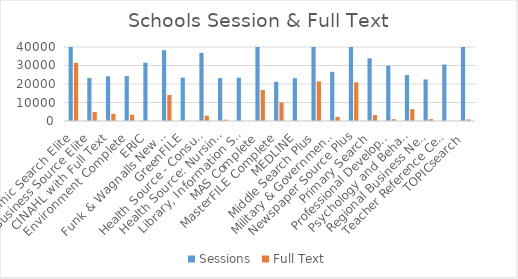
| Category | Sessions | Full Text |
|---|---|---|
| Academic Search Elite | 42030 | 31445 |
| Business Source Elite | 23180 | 4828 |
| CINAHL with Full Text | 24188 | 3913 |
| Environment Complete | 24301 | 3414 |
| ERIC | 31503 | 0 |
| Funk & Wagnalls New World Encyclopedia | 38270 | 14056 |
| GreenFILE | 23423 | 58 |
| Health Source - Consumer Edition | 36804 | 2898 |
| Health Source: Nursing/Academic Edition | 23161 | 703 |
| Library, Information Science & Technology Abstracts | 23407 | 0 |
| MAS Complete | 44137 | 16717 |
| MasterFILE Complete | 21181 | 10035 |
| MEDLINE | 23139 | 0 |
| Middle Search Plus | 49066 | 21399 |
| Military & Government Collection | 26577 | 2203 |
| Newspaper Source Plus | 46702 | 20886 |
| Primary Search | 33920 | 3173 |
| Professional Development Collection | 29880 | 979 |
| Psychology and Behavioral Sciences Collection | 24824 | 6407 |
| Regional Business News | 22467 | 1003 |
| Teacher Reference Center | 30541 | 0 |
| TOPICsearch | 41570 | 833 |